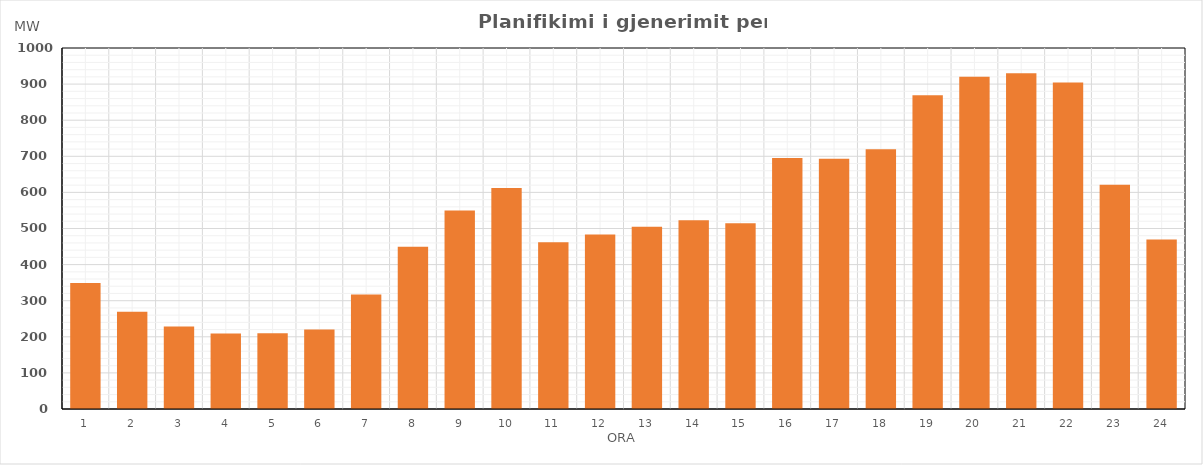
| Category | Max (MW) |
|---|---|
| 0 | 349.36 |
| 1 | 269.43 |
| 2 | 228.6 |
| 3 | 209.31 |
| 4 | 209.49 |
| 5 | 220.07 |
| 6 | 317.39 |
| 7 | 449.12 |
| 8 | 549.82 |
| 9 | 612.42 |
| 10 | 462.06 |
| 11 | 483.45 |
| 12 | 504.74 |
| 13 | 523.12 |
| 14 | 514.64 |
| 15 | 694.99 |
| 16 | 693.5 |
| 17 | 719.24 |
| 18 | 869.24 |
| 19 | 920.02 |
| 20 | 930.35 |
| 21 | 904.55 |
| 22 | 621.25 |
| 23 | 469.35 |